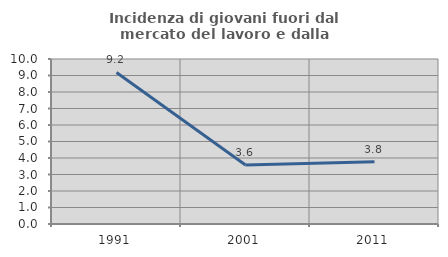
| Category | Incidenza di giovani fuori dal mercato del lavoro e dalla formazione  |
|---|---|
| 1991.0 | 9.184 |
| 2001.0 | 3.571 |
| 2011.0 | 3.774 |